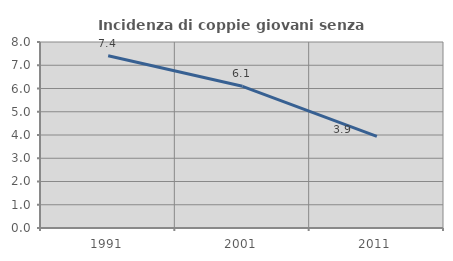
| Category | Incidenza di coppie giovani senza figli |
|---|---|
| 1991.0 | 7.407 |
| 2001.0 | 6.094 |
| 2011.0 | 3.944 |